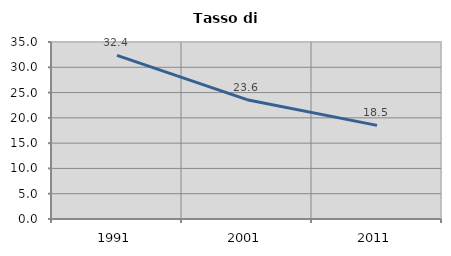
| Category | Tasso di disoccupazione   |
|---|---|
| 1991.0 | 32.367 |
| 2001.0 | 23.59 |
| 2011.0 | 18.519 |